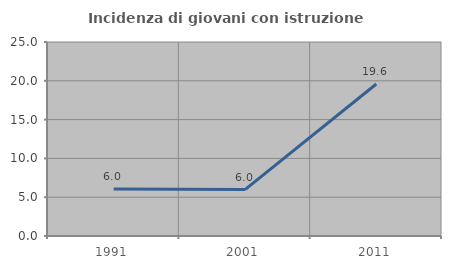
| Category | Incidenza di giovani con istruzione universitaria |
|---|---|
| 1991.0 | 6.044 |
| 2001.0 | 5.978 |
| 2011.0 | 19.582 |